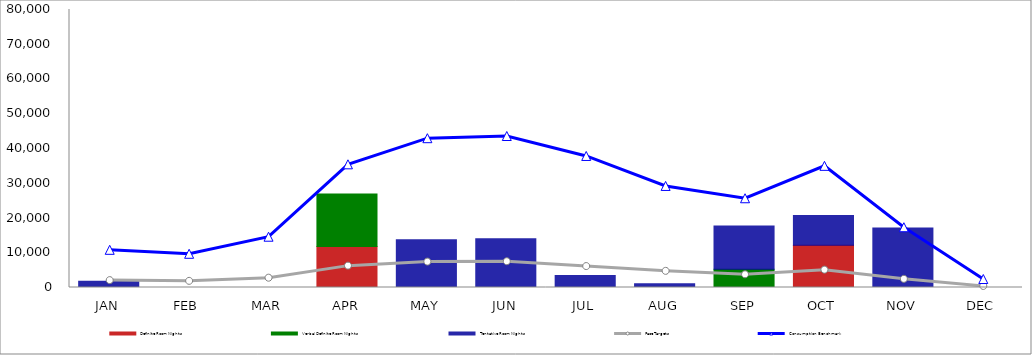
| Category | Definite Room Nights | Verbal Definite Room Nights | Tentative Room Nights |
|---|---|---|---|
| JAN | 0 | 0 | 1800 |
| FEB | 0 | 0 | 0 |
| MAR | 0 | 0 | 0 |
| APR | 11770 | 15137 | 0 |
| MAY | 0 | 0 | 13775 |
| JUN | 0 | 0 | 14000 |
| JUL | 0 | 0 | 3440 |
| AUG | 0 | 0 | 1080 |
| SEP | 0 | 5250 | 12424 |
| OCT | 12155 | 0 | 8535 |
| NOV | 0 | 0 | 17153 |
| DEC | 0 | 0 | 0 |